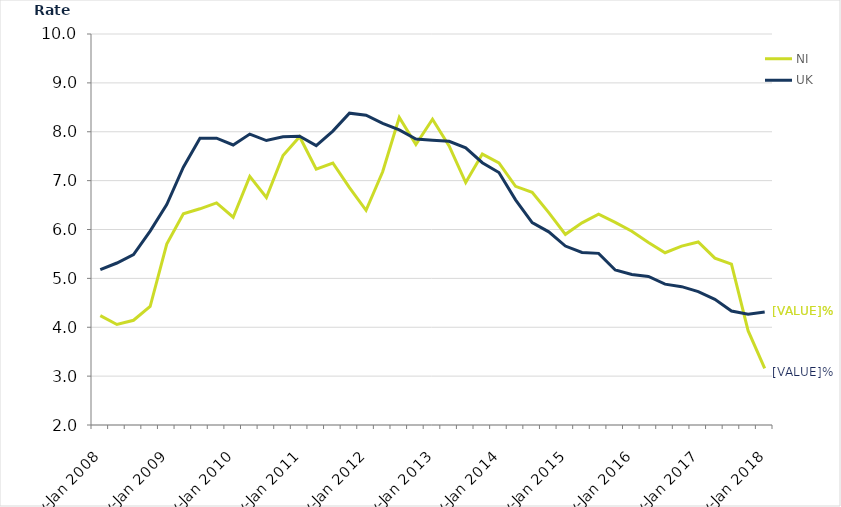
| Category | NI | UK |
|---|---|---|
| Nov-Jan 2008 | 4.239 | 5.177 |
| Feb-Apr 2008 | 4.056 | 5.314 |
| May-Jul 2008 | 4.143 | 5.487 |
| Aug-Oct 2008 | 4.424 | 5.968 |
| Nov-Jan 2009 | 5.7 | 6.511 |
| Feb-Apr 2009 | 6.323 | 7.274 |
| May-Jul 2009 | 6.424 | 7.868 |
| Aug-Oct 2009 | 6.545 | 7.868 |
| Nov-Jan 2010 | 6.251 | 7.729 |
| Feb-Apr 2010 | 7.087 | 7.952 |
| May-Jul 2010 | 6.654 | 7.82 |
| Aug-Oct 2010 | 7.514 | 7.897 |
| Nov-Jan 2011 | 7.898 | 7.909 |
| Feb-Apr 2011 | 7.236 | 7.717 |
| May-Jul 2011 | 7.361 | 8.013 |
| Aug-Oct 2011 | 6.855 | 8.38 |
| Nov-Jan 2012 | 6.392 | 8.338 |
| Feb-Apr 2012 | 7.181 | 8.17 |
| May-Jul 2012 | 8.293 | 8.037 |
| Aug-Oct 2012 | 7.739 | 7.851 |
| Nov-Jan 2013 | 8.257 | 7.825 |
| Feb-Apr 2013 | 7.709 | 7.805 |
| May-Jul 2013 | 6.961 | 7.67 |
| Aug-Oct 2013 | 7.542 | 7.366 |
| Nov-Jan 2014 | 7.365 | 7.165 |
| Feb-Apr 2014 | 6.883 | 6.607 |
| May-Jul 2014 | 6.763 | 6.141 |
| Aug-Oct 2014 | 6.345 | 5.952 |
| Nov-Jan 2015 | 5.901 | 5.662 |
| Feb-Apr 2015 | 6.135 | 5.53 |
| May-Jul 2015 | 6.313 | 5.512 |
| Aug-Oct 2015 | 6.146 | 5.172 |
| Nov-Jan 2016 | 5.965 | 5.08 |
| Feb-Apr 2016 | 5.732 | 5.038 |
| May-Jul 2016 | 5.525 | 4.882 |
| Aug-Oct 2016 | 5.661 | 4.83 |
| Nov-Jan 2017 | 5.744 | 4.728 |
| Feb-Apr 2017 | 5.415 | 4.571 |
| May-Jul 2017 | 5.291 | 4.333 |
| Aug-Oct 2017 | 3.93 | 4.265 |
| Nov-Jan 2018 | 3.158 | 4.313 |